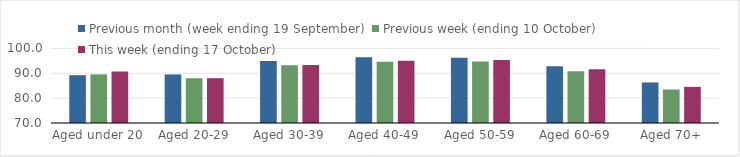
| Category | Previous month (week ending 19 September) | Previous week (ending 10 October) | This week (ending 17 October) |
|---|---|---|---|
| Aged under 20 | 89.23 | 89.55 | 90.76 |
| Aged 20-29 | 89.53 | 88.01 | 88.02 |
| Aged 30-39 | 94.92 | 93.24 | 93.36 |
| Aged 40-49 | 96.48 | 94.64 | 95.08 |
| Aged 50-59 | 96.24 | 94.71 | 95.33 |
| Aged 60-69 | 92.8 | 90.86 | 91.58 |
| Aged 70+ | 86.32 | 83.49 | 84.55 |